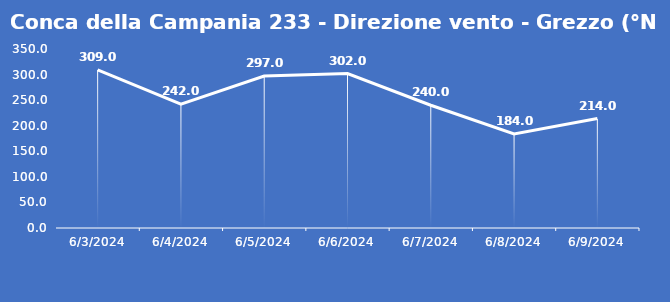
| Category | Conca della Campania 233 - Direzione vento - Grezzo (°N) |
|---|---|
| 6/3/24 | 309 |
| 6/4/24 | 242 |
| 6/5/24 | 297 |
| 6/6/24 | 302 |
| 6/7/24 | 240 |
| 6/8/24 | 184 |
| 6/9/24 | 214 |